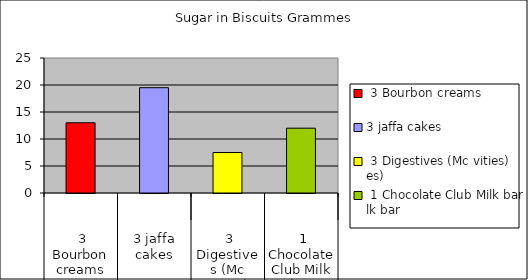
| Category | Sugar in Biscuits Grammes |
|---|---|
| 0 | 13 |
| 1 | 19.5 |
| 2 | 7.5 |
| 3 | 12 |